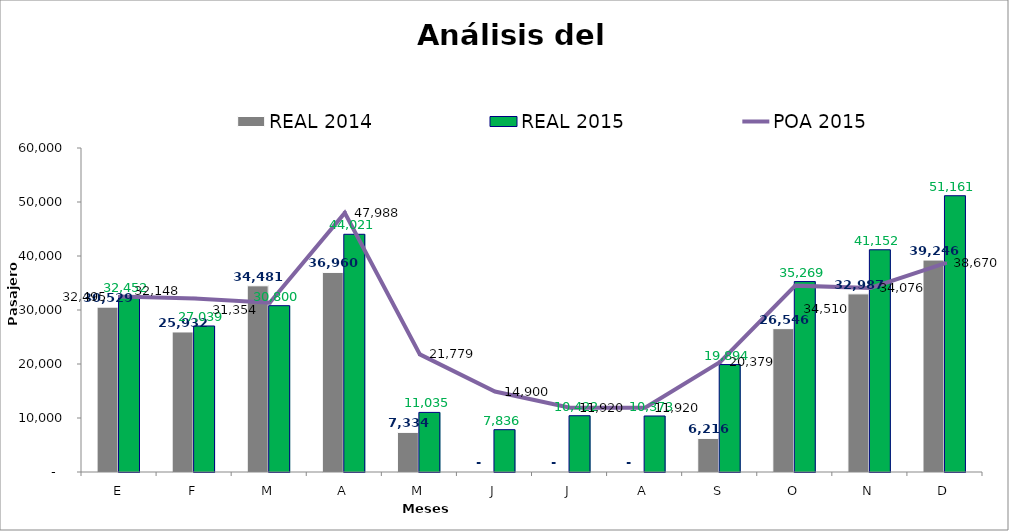
| Category | REAL 2014 | REAL 2015 |
|---|---|---|
| E | 30529 | 32452 |
| F | 25932 | 27039 |
| M | 34481 | 30800 |
| A | 36960 | 44021 |
| M | 7334 | 11035 |
| J | 0 | 7836 |
| J | 0 | 10422 |
| A | 0 | 10373 |
| S | 6216 | 19894 |
| O | 26546 | 35269 |
| N | 32987 | 41152 |
| D | 39246 | 51161 |